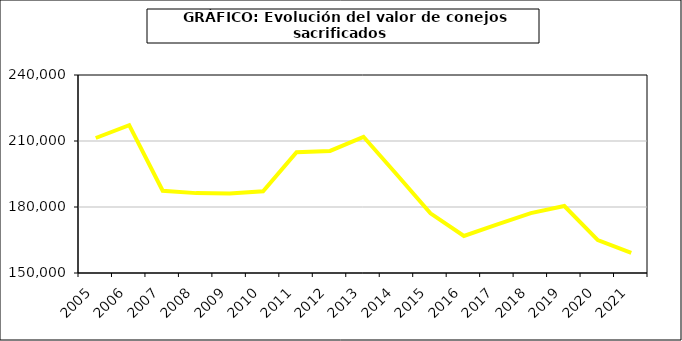
| Category | Peso canal |
|---|---|
| 2005.0 | 211365.141 |
| 2006.0 | 217184.462 |
| 2007.0 | 187399.808 |
| 2008.0 | 186307.329 |
| 2009.0 | 186191.465 |
| 2010.0 | 187154.598 |
| 2011.0 | 204859.313 |
| 2012.0 | 205502.84 |
| 2013.0 | 211908.742 |
| 2014.0 | 194679.563 |
| 2015.0 | 177142.845 |
| 2016.0 | 166839.861 |
| 2017.0 | 172070.125 |
| 2018.0 | 177201.6 |
| 2019.0 | 180442.875 |
| 2020.0 | 164927.14 |
| 2021.0 | 159169.611 |